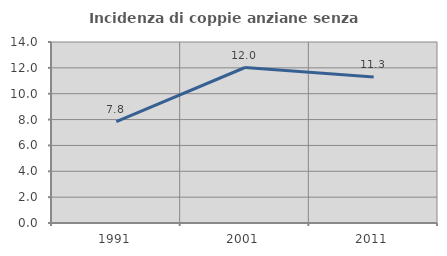
| Category | Incidenza di coppie anziane senza figli  |
|---|---|
| 1991.0 | 7.84 |
| 2001.0 | 12.027 |
| 2011.0 | 11.285 |